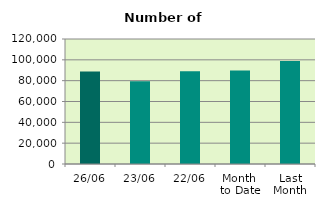
| Category | Series 0 |
|---|---|
| 26/06 | 88878 |
| 23/06 | 79336 |
| 22/06 | 89020 |
| Month 
to Date | 89653.111 |
| Last
Month | 98885.545 |